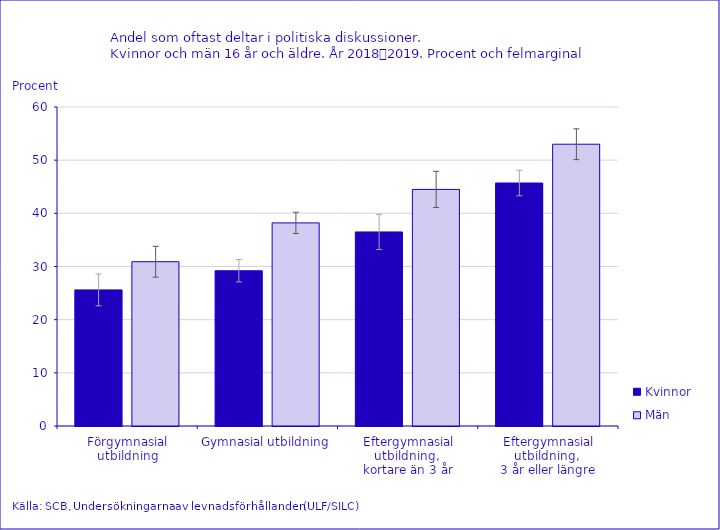
| Category | Kvinnor | Män |
|---|---|---|
| Förgymnasial utbildning | 25.6 | 30.9 |
| Gymnasial utbildning | 29.2 | 38.2 |
| Eftergymnasial utbildning, 
kortare än 3 år | 36.5 | 44.5 |
| Eftergymnasial utbildning, 
3 år eller längre | 45.7 | 53 |